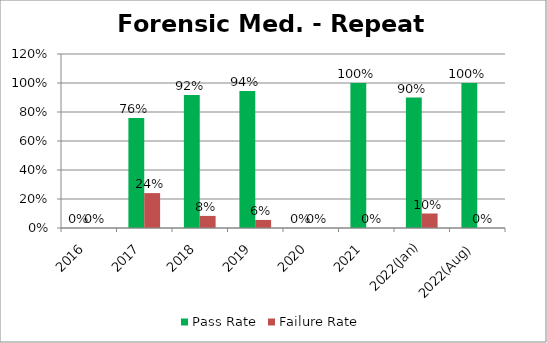
| Category | Pass Rate | Failure Rate |
|---|---|---|
| 2016 | 0 | 0 |
| 2017 | 0.759 | 0.241 |
| 2018 | 0.917 | 0.083 |
| 2019 | 0.944 | 0.056 |
| 2020 | 0 | 0 |
| 2021 | 1 | 0 |
| 2022(Jan) | 0.9 | 0.1 |
| 2022(Aug) | 1 | 0 |